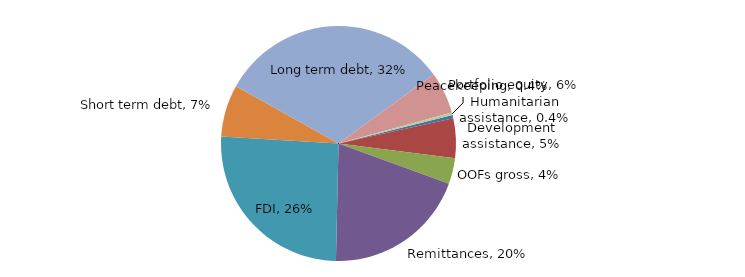
| Category | Series 0 |
|---|---|
| Humanitarian assistance | 0.004 |
| Development assistance | 0.054 |
| OOFs gross | 0.036 |
| Remittances | 0.197 |
| FDI | 0.256 |
| Short term debt | 0.071 |
| Long term debt | 0.318 |
| Portfolio equity | 0.057 |
| Peacekeeping | 0.004 |